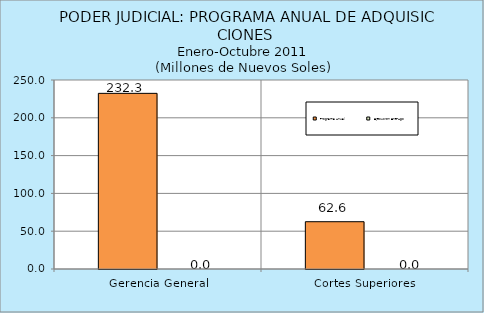
| Category | Programa Anual | Ejecución Ene-Ago |
|---|---|---|
| Gerencia General | 232.343 | 0 |
| Cortes Superiores | 62.553 | 0 |